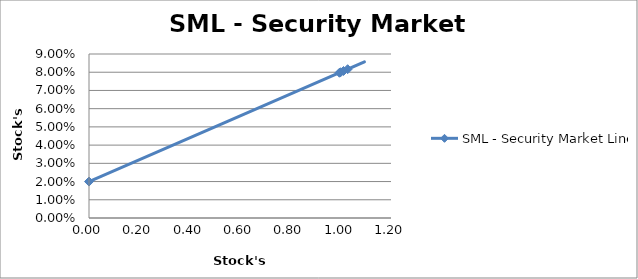
| Category | SML - Security Market Line |
|---|---|
| 1.011438030917279 | 0.081 |
| 0.9952012397190928 | 0.08 |
| 1.0277468587627574 | 0.082 |
| 0.0 | 0.02 |
| 1.0 | 0.08 |